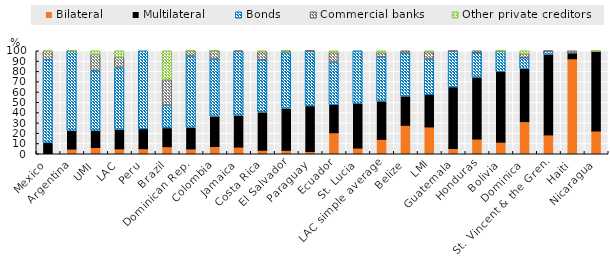
| Category | Bilateral | Multilateral | Bonds | Commercial banks | Other private creditors |
|---|---|---|---|---|---|
| Mexico | 0.952 | 10.06 | 80.383 | 8.095 | 0.511 |
| Argentina | 5.253 | 17.537 | 77.166 | 0.037 | 0.006 |
| UMI | 6.801 | 16.044 | 57.803 | 15.843 | 3.508 |
| LAC | 5.511 | 18.318 | 59.951 | 10.109 | 6.112 |
| Peru | 5.642 | 18.565 | 75.793 | 0 | 0 |
| Brazil | 7.612 | 17.533 | 22.077 | 24.734 | 28.044 |
| Dominican Rep. | 5.44 | 20.03 | 69.439 | 5.074 | 0.017 |
| Colombia | 7.805 | 28.672 | 55.504 | 8.018 | 0.001 |
| Jamaica | 7.213 | 30.092 | 62.058 | 0.636 | 0 |
| Costa Rica | 4.088 | 36.397 | 50.704 | 7.981 | 0.83 |
| El Salvador | 4.071 | 40.185 | 54.536 | 1.107 | 0.101 |
| Paraguay | 2.948 | 43.559 | 53.291 | 0.202 | 0 |
| Ecuador | 21.125 | 26.534 | 41.343 | 9.517 | 1.481 |
| St. Lucia | 6.271 | 42.321 | 51.408 | 0 | 0 |
| LAC simple average | 14.711 | 36.41 | 42.951 | 4.284 | 1.644 |
| Belize | 28.345 | 27.679 | 41.831 | 2.145 | 0 |
| LMI | 26.747 | 30.529 | 34.73 | 7.027 | 0.967 |
| Guatemala | 5.85 | 59.055 | 34.764 | 0.331 | 0 |
| Honduras | 15.015 | 59.408 | 23.63 | 1.946 | 0 |
| Bolivia | 11.953 | 67.771 | 20.194 | 0.056 | 0.026 |
| Dominica | 31.926 | 50.844 | 10.473 | 3.997 | 2.76 |
| St. Vincent & the Gren. | 19.024 | 77.603 | 2.941 | 0.432 | 0 |
| Haiti | 92.927 | 4.935 | 0 | 2.138 | 0 |
| Nicaragua | 22.79 | 76.715 | 0 | 0.254 | 0.241 |